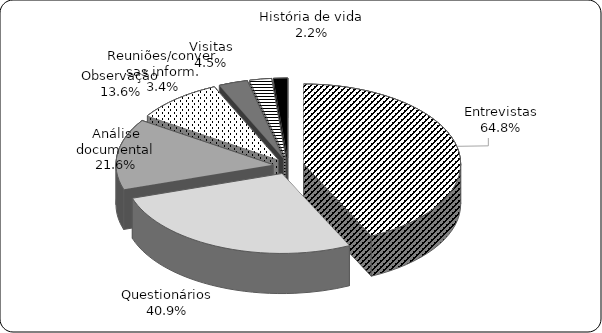
| Category | Series 0 |
|---|---|
| Entrevistas | 0.648 |
| Questionários | 0.409 |
| Análise documental | 0.216 |
| Observação | 0.136 |
| Visitas | 0.045 |
| Reuniões/conversas inform. | 0.034 |
| História de vida | 0.022 |